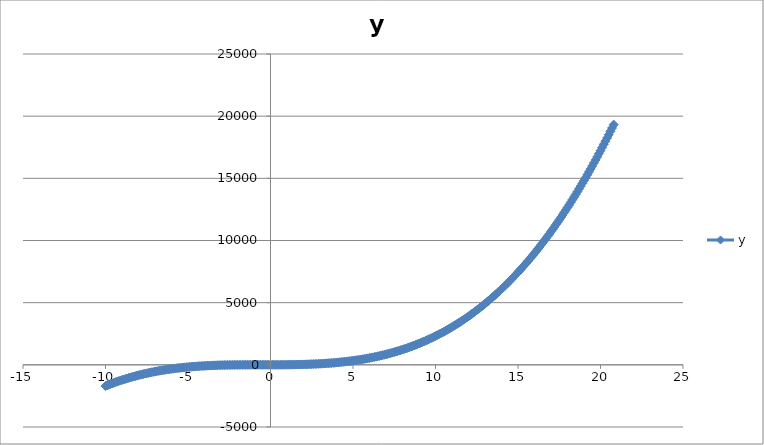
| Category | y |
|---|---|
| -10.0 | -1707 |
| -9.9 | -1653.468 |
| -9.8 | -1601.064 |
| -9.7 | -1549.776 |
| -9.6 | -1499.592 |
| -9.5 | -1450.5 |
| -9.4 | -1402.488 |
| -9.3 | -1355.544 |
| -9.2 | -1309.656 |
| -9.1 | -1264.812 |
| -9.0 | -1221 |
| -8.9 | -1178.208 |
| -8.8 | -1136.424 |
| -8.7 | -1095.636 |
| -8.6 | -1055.832 |
| -8.50000000000001 | -1017 |
| -8.40000000000001 | -979.128 |
| -8.30000000000001 | -942.204 |
| -8.20000000000001 | -906.216 |
| -8.10000000000001 | -871.152 |
| -8.00000000000001 | -837 |
| -7.90000000000001 | -803.748 |
| -7.80000000000001 | -771.384 |
| -7.70000000000001 | -739.896 |
| -7.60000000000001 | -709.272 |
| -7.50000000000001 | -679.5 |
| -7.40000000000001 | -650.568 |
| -7.30000000000001 | -622.464 |
| -7.20000000000001 | -595.176 |
| -7.10000000000001 | -568.692 |
| -7.00000000000001 | -543 |
| -6.90000000000001 | -518.088 |
| -6.80000000000001 | -493.944 |
| -6.70000000000001 | -470.556 |
| -6.60000000000001 | -447.912 |
| -6.50000000000001 | -426 |
| -6.40000000000001 | -404.808 |
| -6.30000000000001 | -384.324 |
| -6.20000000000001 | -364.536 |
| -6.10000000000001 | -345.432 |
| -6.00000000000001 | -327 |
| -5.90000000000001 | -309.228 |
| -5.80000000000001 | -292.104 |
| -5.70000000000002 | -275.616 |
| -5.60000000000002 | -259.752 |
| -5.50000000000002 | -244.5 |
| -5.40000000000002 | -229.848 |
| -5.30000000000002 | -215.784 |
| -5.20000000000002 | -202.296 |
| -5.10000000000002 | -189.372 |
| -5.00000000000002 | -177 |
| -4.90000000000002 | -165.168 |
| -4.80000000000002 | -153.864 |
| -4.70000000000002 | -143.076 |
| -4.60000000000002 | -132.792 |
| -4.50000000000002 | -123 |
| -4.40000000000002 | -113.688 |
| -4.30000000000002 | -104.844 |
| -4.20000000000002 | -96.456 |
| -4.10000000000002 | -88.512 |
| -4.00000000000002 | -81 |
| -3.90000000000002 | -73.908 |
| -3.80000000000002 | -67.224 |
| -3.70000000000002 | -60.936 |
| -3.60000000000002 | -55.032 |
| -3.50000000000002 | -49.5 |
| -3.40000000000002 | -44.328 |
| -3.30000000000002 | -39.504 |
| -3.20000000000002 | -35.016 |
| -3.10000000000002 | -30.852 |
| -3.00000000000002 | -27 |
| -2.90000000000003 | -23.448 |
| -2.80000000000003 | -20.184 |
| -2.70000000000003 | -17.196 |
| -2.60000000000003 | -14.472 |
| -2.50000000000003 | -12 |
| -2.40000000000003 | -9.768 |
| -2.30000000000003 | -7.764 |
| -2.20000000000003 | -5.976 |
| -2.10000000000003 | -4.392 |
| -2.00000000000003 | -3 |
| -1.90000000000003 | -1.788 |
| -1.80000000000003 | -0.744 |
| -1.70000000000003 | 0.144 |
| -1.60000000000003 | 0.888 |
| -1.50000000000003 | 1.5 |
| -1.40000000000003 | 1.992 |
| -1.30000000000003 | 2.376 |
| -1.20000000000003 | 2.664 |
| -1.10000000000003 | 2.868 |
| -1.00000000000003 | 3 |
| -0.900000000000031 | 3.072 |
| -0.800000000000029 | 3.096 |
| -0.700000000000029 | 3.084 |
| -0.60000000000003 | 3.048 |
| -0.50000000000003 | 3 |
| -0.400000000000031 | 2.952 |
| -0.300000000000029 | 2.916 |
| -0.200000000000029 | 2.904 |
| -0.100000000000041 | 2.928 |
| 0.0 | 0 |
| 0.0999999999999996 | 3.132 |
| 0.199999999999999 | 3.336 |
| 0.300000000000001 | 3.624 |
| 0.4 | 4.008 |
| 0.5 | 4.5 |
| 0.6 | 5.112 |
| 0.699999999999999 | 5.856 |
| 0.800000000000001 | 6.744 |
| 0.9 | 7.788 |
| 1.0 | 9 |
| 1.1 | 10.392 |
| 1.2 | 11.976 |
| 1.3 | 13.764 |
| 1.4 | 15.768 |
| 1.5 | 18 |
| 1.6 | 20.472 |
| 1.7 | 23.196 |
| 1.8 | 26.184 |
| 1.9 | 29.448 |
| 2.0 | 33 |
| 2.1 | 36.852 |
| 2.2 | 41.016 |
| 2.3 | 45.504 |
| 2.4 | 50.328 |
| 2.5 | 55.5 |
| 2.6 | 61.032 |
| 2.7 | 66.936 |
| 2.8 | 73.224 |
| 2.9 | 79.908 |
| 3.0 | 87 |
| 3.1 | 94.512 |
| 3.2 | 102.456 |
| 3.3 | 110.844 |
| 3.4 | 119.688 |
| 3.5 | 129 |
| 3.6 | 138.792 |
| 3.7 | 149.076 |
| 3.8 | 159.864 |
| 3.9 | 171.168 |
| 4.0 | 183 |
| 4.0999999999999 | 195.372 |
| 4.1999999999999 | 208.296 |
| 4.2999999999999 | 221.784 |
| 4.3999999999999 | 235.848 |
| 4.4999999999999 | 250.5 |
| 4.5999999999999 | 265.752 |
| 4.6999999999999 | 281.616 |
| 4.7999999999999 | 298.104 |
| 4.8999999999999 | 315.228 |
| 4.9999999999999 | 333 |
| 5.0999999999999 | 351.432 |
| 5.1999999999999 | 370.536 |
| 5.2999999999999 | 390.324 |
| 5.3999999999999 | 410.808 |
| 5.4999999999999 | 432 |
| 5.5999999999999 | 453.912 |
| 5.6999999999999 | 476.556 |
| 5.7999999999999 | 499.944 |
| 5.8999999999999 | 524.088 |
| 5.9999999999999 | 549 |
| 6.0999999999999 | 574.692 |
| 6.1999999999999 | 601.176 |
| 6.2999999999999 | 628.464 |
| 6.3999999999999 | 656.568 |
| 6.4999999999999 | 685.5 |
| 6.5999999999999 | 715.272 |
| 6.6999999999999 | 745.896 |
| 6.7999999999999 | 777.384 |
| 6.8999999999999 | 809.748 |
| 6.9999999999999 | 843 |
| 7.0999999999999 | 877.152 |
| 7.1999999999999 | 912.216 |
| 7.2999999999999 | 948.204 |
| 7.3999999999999 | 985.128 |
| 7.4999999999999 | 1023 |
| 7.5999999999999 | 1061.832 |
| 7.6999999999999 | 1101.636 |
| 7.7999999999999 | 1142.424 |
| 7.8999999999999 | 1184.208 |
| 7.9999999999999 | 1227 |
| 8.0999999999999 | 1270.812 |
| 8.1999999999999 | 1315.656 |
| 8.2999999999999 | 1361.544 |
| 8.3999999999999 | 1408.488 |
| 8.4999999999999 | 1456.5 |
| 8.5999999999999 | 1505.592 |
| 8.6999999999999 | 1555.776 |
| 8.7999999999999 | 1607.064 |
| 8.8999999999999 | 1659.468 |
| 8.9999999999999 | 1713 |
| 9.0999999999999 | 1767.672 |
| 9.1999999999999 | 1823.496 |
| 9.2999999999999 | 1880.484 |
| 9.3999999999999 | 1938.648 |
| 9.4999999999999 | 1998 |
| 9.5999999999999 | 2058.552 |
| 9.6999999999999 | 2120.316 |
| 9.7999999999999 | 2183.304 |
| 9.8999999999999 | 2247.528 |
| 9.9999999999999 | 2313 |
| 10.0999999999999 | 2379.732 |
| 10.1999999999999 | 2447.736 |
| 10.2999999999999 | 2517.024 |
| 10.3999999999999 | 2587.608 |
| 10.4999999999999 | 2659.5 |
| 10.5999999999999 | 2732.712 |
| 10.6999999999999 | 2807.256 |
| 10.7999999999999 | 2883.144 |
| 10.8999999999999 | 2960.388 |
| 10.9999999999999 | 3039 |
| 11.0999999999999 | 3118.992 |
| 11.1999999999999 | 3200.376 |
| 11.2999999999999 | 3283.164 |
| 11.3999999999999 | 3367.368 |
| 11.4999999999999 | 3453 |
| 11.5999999999999 | 3540.072 |
| 11.6999999999999 | 3628.596 |
| 11.7999999999999 | 3718.584 |
| 11.8999999999999 | 3810.048 |
| 11.9999999999999 | 3903 |
| 12.0999999999999 | 3997.452 |
| 12.1999999999999 | 4093.416 |
| 12.2999999999999 | 4190.904 |
| 12.3999999999999 | 4289.928 |
| 12.4999999999999 | 4390.5 |
| 12.5999999999999 | 4492.632 |
| 12.6999999999999 | 4596.336 |
| 12.7999999999999 | 4701.624 |
| 12.8999999999999 | 4808.508 |
| 12.9999999999999 | 4917 |
| 13.0999999999999 | 5027.112 |
| 13.1999999999999 | 5138.856 |
| 13.2999999999999 | 5252.244 |
| 13.3999999999999 | 5367.288 |
| 13.4999999999999 | 5484 |
| 13.5999999999999 | 5602.392 |
| 13.6999999999999 | 5722.476 |
| 13.7999999999999 | 5844.264 |
| 13.8999999999999 | 5967.768 |
| 13.9999999999999 | 6093 |
| 14.0999999999999 | 6219.972 |
| 14.1999999999999 | 6348.696 |
| 14.2999999999999 | 6479.184 |
| 14.3999999999999 | 6611.448 |
| 14.4999999999999 | 6745.5 |
| 14.5999999999999 | 6881.352 |
| 14.6999999999999 | 7019.016 |
| 14.7999999999999 | 7158.504 |
| 14.8999999999999 | 7299.828 |
| 14.9999999999999 | 7443 |
| 15.0999999999999 | 7588.032 |
| 15.1999999999999 | 7734.936 |
| 15.2999999999999 | 7883.724 |
| 15.3999999999999 | 8034.408 |
| 15.4999999999999 | 8187 |
| 15.5999999999999 | 8341.512 |
| 15.6999999999999 | 8497.956 |
| 15.7999999999999 | 8656.344 |
| 15.8999999999999 | 8816.688 |
| 15.9999999999999 | 8979 |
| 16.0999999999999 | 9143.292 |
| 16.1999999999999 | 9309.576 |
| 16.2999999999999 | 9477.864 |
| 16.3999999999999 | 9648.168 |
| 16.4999999999999 | 9820.5 |
| 16.5999999999999 | 9994.872 |
| 16.6999999999999 | 10171.296 |
| 16.7999999999999 | 10349.784 |
| 16.8999999999999 | 10530.348 |
| 16.9999999999999 | 10713 |
| 17.0999999999999 | 10897.752 |
| 17.1999999999999 | 11084.616 |
| 17.2999999999999 | 11273.604 |
| 17.3999999999999 | 11464.728 |
| 17.4999999999999 | 11658 |
| 17.5999999999999 | 11853.432 |
| 17.6999999999999 | 12051.036 |
| 17.7999999999999 | 12250.824 |
| 17.8999999999999 | 12452.808 |
| 17.9999999999999 | 12657 |
| 18.0999999999999 | 12863.412 |
| 18.1999999999999 | 13072.056 |
| 18.2999999999999 | 13282.944 |
| 18.3999999999999 | 13496.088 |
| 18.4999999999999 | 13711.5 |
| 18.5999999999999 | 13929.192 |
| 18.6999999999999 | 14149.176 |
| 18.7999999999999 | 14371.464 |
| 18.8999999999999 | 14596.068 |
| 18.9999999999999 | 14823 |
| 19.0999999999999 | 15052.272 |
| 19.1999999999999 | 15283.896 |
| 19.2999999999999 | 15517.884 |
| 19.3999999999999 | 15754.248 |
| 19.4999999999999 | 15993 |
| 19.5999999999999 | 16234.152 |
| 19.6999999999999 | 16477.716 |
| 19.7999999999999 | 16723.704 |
| 19.8999999999999 | 16972.128 |
| 19.9999999999999 | 17223 |
| 20.0999999999999 | 17476.332 |
| 20.1999999999999 | 17732.136 |
| 20.2999999999999 | 17990.424 |
| 20.3999999999999 | 18251.208 |
| 20.4999999999999 | 18514.5 |
| 20.5999999999999 | 18780.312 |
| 20.6999999999999 | 19048.656 |
| 20.7999999999999 | 19319.544 |